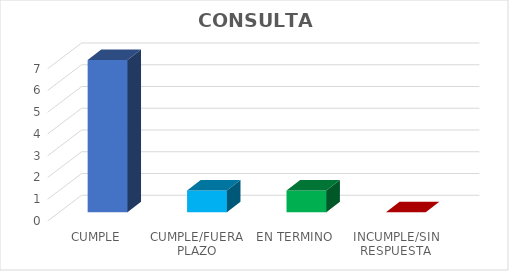
| Category | Series 0 |
|---|---|
| CUMPLE | 7 |
| CUMPLE/FUERA PLAZO | 1 |
| EN TERMINO | 1 |
| INCUMPLE/SIN RESPUESTA | 0 |